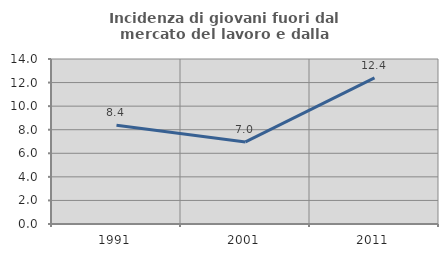
| Category | Incidenza di giovani fuori dal mercato del lavoro e dalla formazione  |
|---|---|
| 1991.0 | 8.377 |
| 2001.0 | 6.962 |
| 2011.0 | 12.397 |